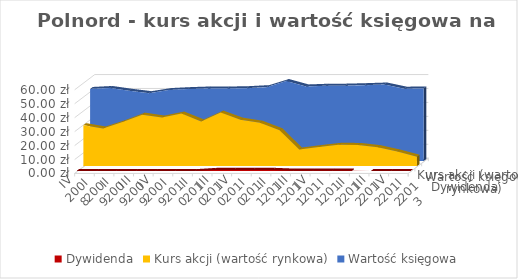
| Category | Dywidenda | Kurs akcji (wartość rynkowa) | Wartość księgowa |
|---|---|---|---|
| IV 2008 | 0 | 29.29 | 51.576 |
| I 2009 | 0 | 26.9 | 52.298 |
| II 2009 | 0 | 31.5 | 50.267 |
| III 2009 | 0 | 36.83 | 48.572 |
| IV 2009 | 0 | 34.75 | 50.797 |
| I 2010 | 0 | 37.61 | 51.482 |
| II 2010 | 0 | 32 | 51.93 |
| III 2010 | 0.86 | 38.28 | 51.889 |
| IV 2010 | 0.86 | 33.2 | 52.183 |
| I 2011 | 0.86 | 31 | 52.912 |
| II 2011 | 0.86 | 25.65 | 57.271 |
| III 2011 | 0.32 | 11.8 | 53.401 |
| IV 2011 | 0.32 | 13.6 | 53.89 |
| I 2012 | 0.32 | 15.2 | 53.971 |
| II 2012 | 0.32 | 15.1 | 54.345 |
| III 2012 | 0 | 13.5 | 54.776 |
| IV 2012 | 0 | 10.4 | 51.797 |
| I 2013 | 0 | 6.65 | 51.887 |